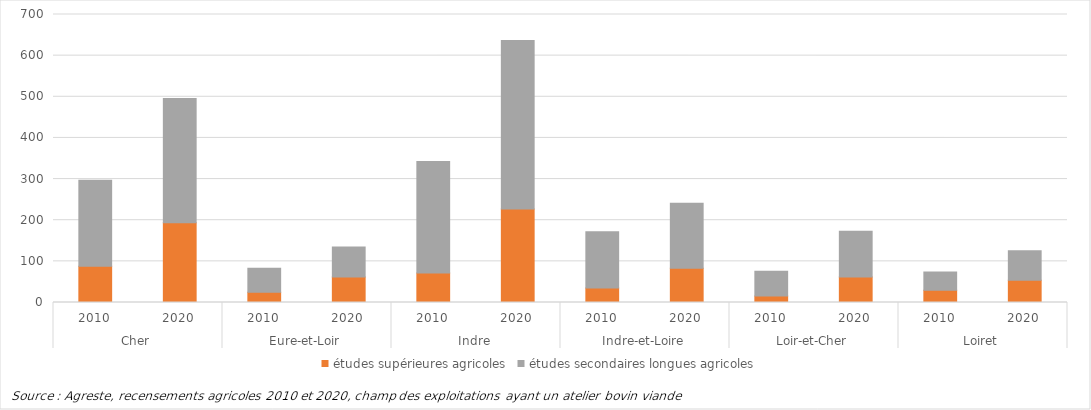
| Category | études supérieures agricoles | études secondaires longues agricoles |
|---|---|---|
| 0 | 88 | 209 |
| 1 | 194 | 302 |
| 2 | 25 | 58 |
| 3 | 62 | 73 |
| 4 | 72 | 271 |
| 5 | 227 | 410 |
| 6 | 35 | 137 |
| 7 | 83 | 158 |
| 8 | 16 | 60 |
| 9 | 62 | 111 |
| 10 | 30 | 44 |
| 11 | 54 | 72 |